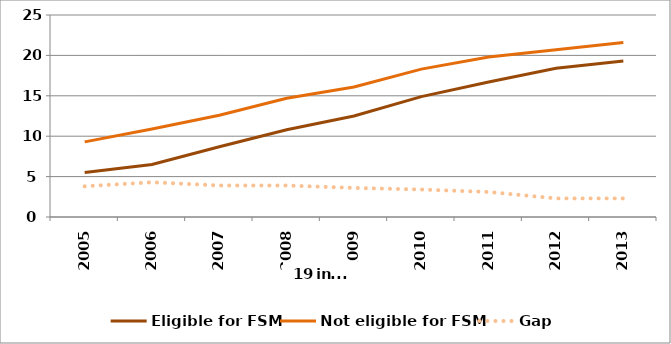
| Category | Eligible for FSM | Not eligible for FSM | Gap |
|---|---|---|---|
| 2005.0 | 5.5 | 9.3 | 3.8 |
| 2006.0 | 6.5 | 10.9 | 4.3 |
| 2007.0 | 8.7 | 12.6 | 3.9 |
| 2008.0 | 10.8 | 14.7 | 3.9 |
| 2009.0 | 12.5 | 16.1 | 3.6 |
| 2010.0 | 14.9 | 18.3 | 3.4 |
| 2011.0 | 16.7 | 19.8 | 3.1 |
| 2012.0 | 18.4 | 20.7 | 2.3 |
| 2013.0 | 19.3 | 21.6 | 2.3 |